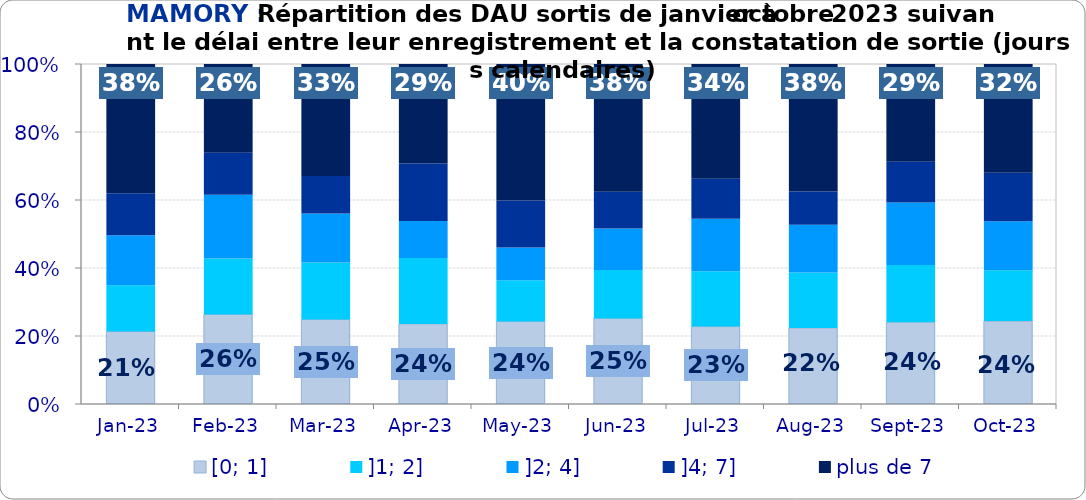
| Category | [0; 1] | ]1; 2] | ]2; 4] | ]4; 7] | plus de 7 |
|---|---|---|---|---|---|
| 2023-01-01 | 0.213 | 0.136 | 0.148 | 0.123 | 0.38 |
| 2023-02-01 | 0.263 | 0.165 | 0.187 | 0.123 | 0.261 |
| 2023-03-01 | 0.248 | 0.168 | 0.145 | 0.11 | 0.329 |
| 2023-04-01 | 0.235 | 0.194 | 0.109 | 0.169 | 0.293 |
| 2023-05-01 | 0.243 | 0.121 | 0.096 | 0.138 | 0.402 |
| 2023-06-01 | 0.252 | 0.143 | 0.122 | 0.108 | 0.376 |
| 2023-07-01 | 0.228 | 0.163 | 0.154 | 0.118 | 0.337 |
| 2023-08-01 | 0.223 | 0.163 | 0.141 | 0.098 | 0.375 |
| 2023-09-01 | 0.241 | 0.168 | 0.183 | 0.12 | 0.287 |
| 2023-10-01 | 0.244 | 0.149 | 0.144 | 0.143 | 0.32 |